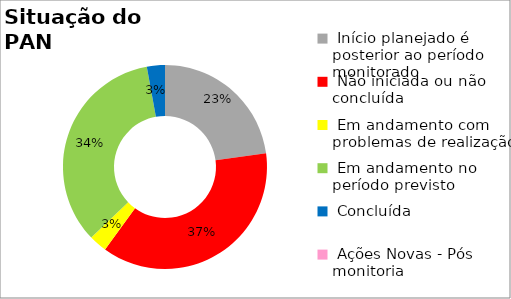
| Category | Series 0 |
|---|---|
|  Início planejado é posterior ao período monitorado | 0.229 |
|  Não iniciada ou não concluída | 0.371 |
|  Em andamento com problemas de realização | 0.029 |
|  Em andamento no período previsto  | 0.343 |
|  Concluída | 0.029 |
|  Ações Novas - Pós monitoria | 0 |